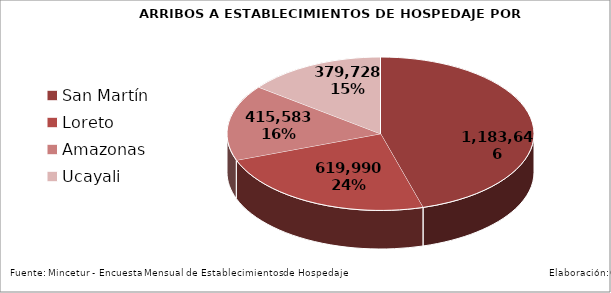
| Category | Series 0 |
|---|---|
| San Martín | 1183646 |
| Loreto | 619990 |
| Amazonas | 415583 |
| Ucayali | 379728 |